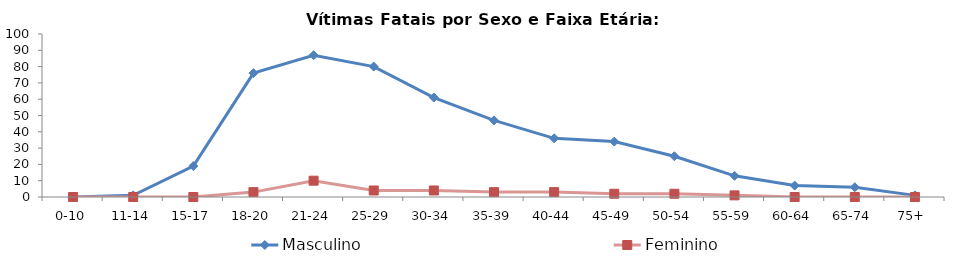
| Category | Masculino | Feminino |
|---|---|---|
| 0-10 | 0 | 0 |
| 11-14 | 1 | 0 |
| 15-17 | 19 | 0 |
| 18-20 | 76 | 3 |
| 21-24 | 87 | 10 |
| 25-29 | 80 | 4 |
| 30-34 | 61 | 4 |
| 35-39 | 47 | 3 |
| 40-44 | 36 | 3 |
| 45-49 | 34 | 2 |
| 50-54 | 25 | 2 |
| 55-59 | 13 | 1 |
| 60-64 | 7 | 0 |
| 65-74 | 6 | 0 |
| 75+ | 1 | 0 |